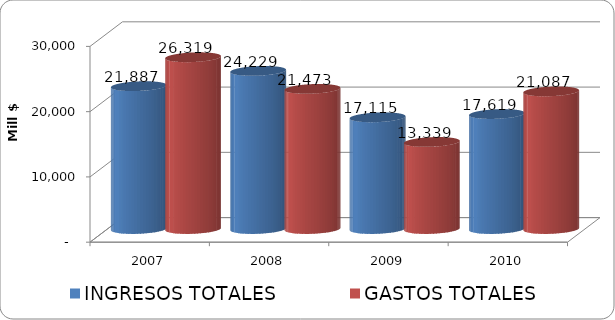
| Category | INGRESOS TOTALES | GASTOS TOTALES |
|---|---|---|
| 2007 | 21886.54 | 26318.934 |
| 2008 | 24228.811 | 21473.304 |
| 2009 | 17114.734 | 13339.486 |
| 2010 | 17619.137 | 21087.042 |